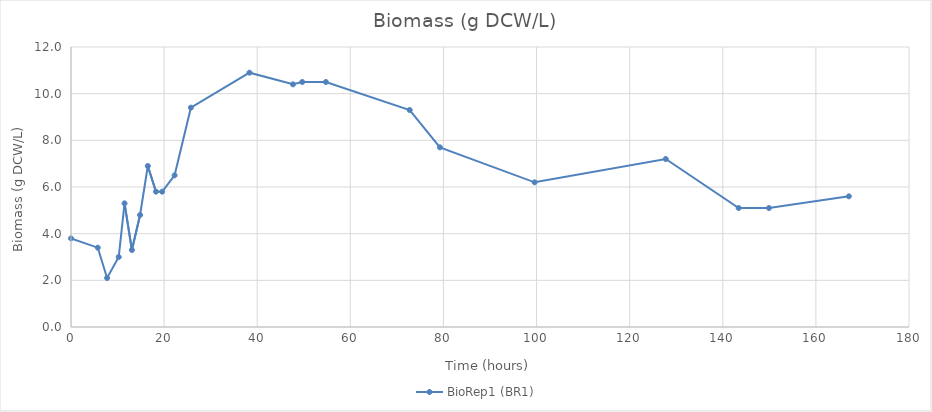
| Category | BioRep1 (BR1) |
|---|---|
| 0.0 | 3.8 |
| 5.750000000058208 | 3.4 |
| 7.749999999941792 | 2.1 |
| 10.250000000058208 | 3 |
| 11.499999999941792 | 5.3 |
| 13.083333333372138 | 3.3 |
| 14.83333333331393 | 4.8 |
| 16.5 | 6.9 |
| 18.249999999941792 | 5.8 |
| 19.583333333255723 | 5.8 |
| 22.250000000058208 | 6.5 |
| 25.749999999941792 | 9.4 |
| 38.33333333325572 | 10.9 |
| 47.683333333348855 | 10.4 |
| 49.66666666668607 | 10.5 |
| 54.75 | 10.5 |
| 72.75 | 9.3 |
| 79.25000000005821 | 7.7 |
| 99.58333333331393 | 6.2 |
| 127.74999999994179 | 7.2 |
| 143.41666666668607 | 5.1 |
| 149.91666666674428 | 5.1 |
| 167.08333333331393 | 5.6 |